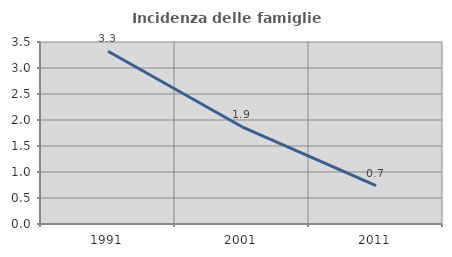
| Category | Incidenza delle famiglie numerose |
|---|---|
| 1991.0 | 3.321 |
| 2001.0 | 1.869 |
| 2011.0 | 0.739 |